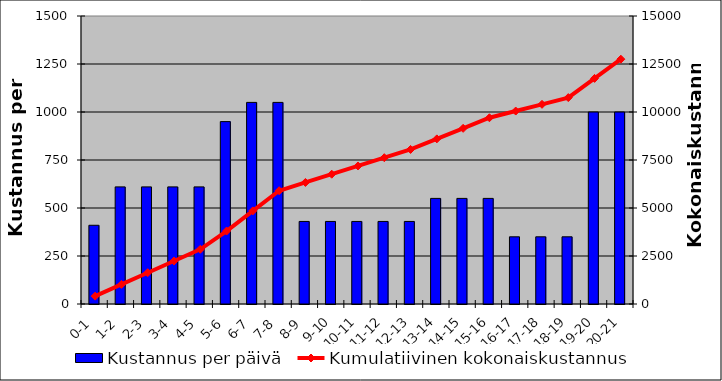
| Category | Kustannus per päivä |
|---|---|
| 0-1 | 410 |
| 1-2 | 610 |
| 2-3 | 610 |
| 3-4 | 610 |
| 4-5 | 610 |
| 5-6 | 950 |
| 6-7 | 1050 |
| 7-8 | 1050 |
| 8-9 | 430 |
| 9-10 | 430 |
| 10-11 | 430 |
| 11-12 | 430 |
| 12-13 | 430 |
| 13-14 | 550 |
| 14-15 | 550 |
| 15-16 | 550 |
| 16-17 | 350 |
| 17-18 | 350 |
| 18-19 | 350 |
| 19-20 | 1000 |
| 20-21 | 1000 |